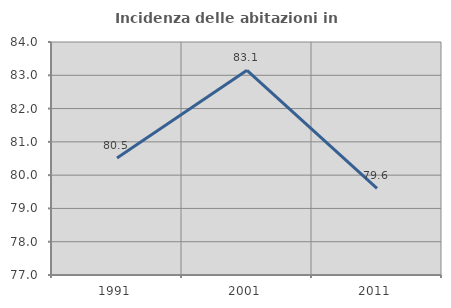
| Category | Incidenza delle abitazioni in proprietà  |
|---|---|
| 1991.0 | 80.516 |
| 2001.0 | 83.149 |
| 2011.0 | 79.602 |